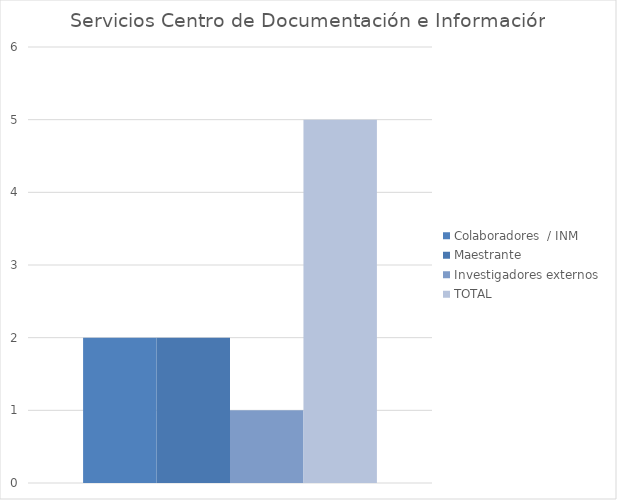
| Category | Colaboradores  / INM | Maestrante | Investigadores externos | TOTAL  |
|---|---|---|---|---|
| 0 | 2 | 2 | 1 | 5 |